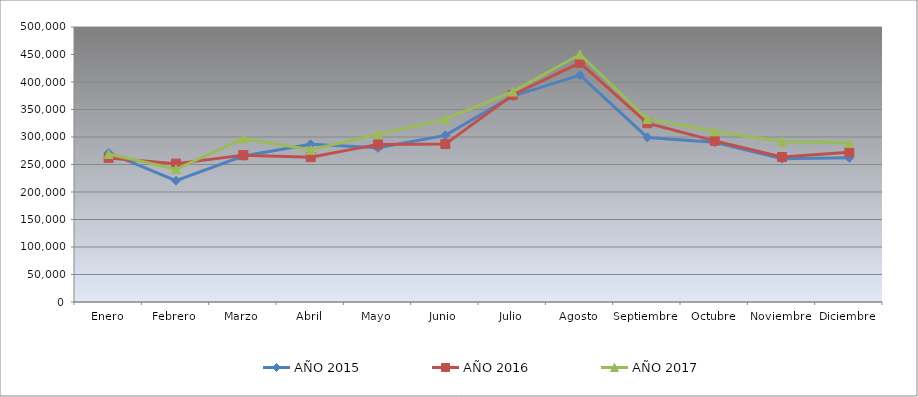
| Category | AÑO 2015 | AÑO 2016 | AÑO 2017 |
|---|---|---|---|
| Enero | 271140 | 261940 | 269060 |
| Febrero | 220460 | 251600 | 241300 |
| Marzo | 265500 | 267040 | 297190 |
| Abril | 286760 | 263340 | 276690 |
| Mayo | 280280 | 286580 | 305100 |
| Junio | 302980 | 287060 | 332440 |
| Julio | 374300 | 376340 | 382620 |
| Agosto | 412500 | 434900 | 450020 |
| Septiembre | 299240 | 325080 | 332500 |
| Octubre | 290440 | 293000 | 310360 |
| Noviembre | 260600 | 263620 | 291710 |
| Diciembre | 262100 | 272200 | 289020 |